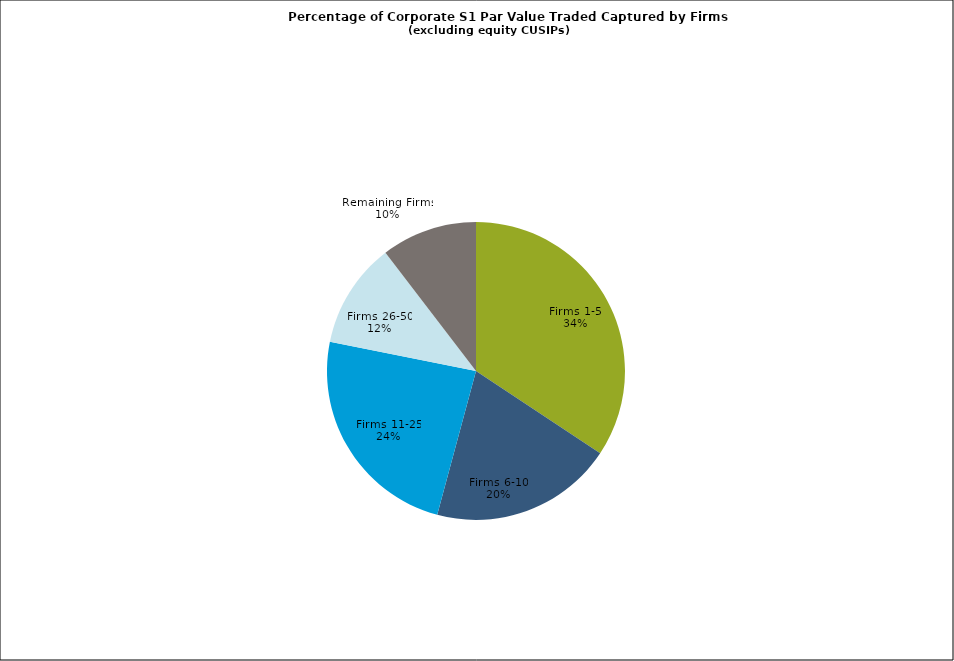
| Category | Series 0 |
|---|---|
| Firms 1-5 | 0.343 |
| Firms 6-10 | 0.199 |
| Firms 11-25 | 0.24 |
| Firms 26-50 | 0.115 |
| Remaining Firms | 0.104 |